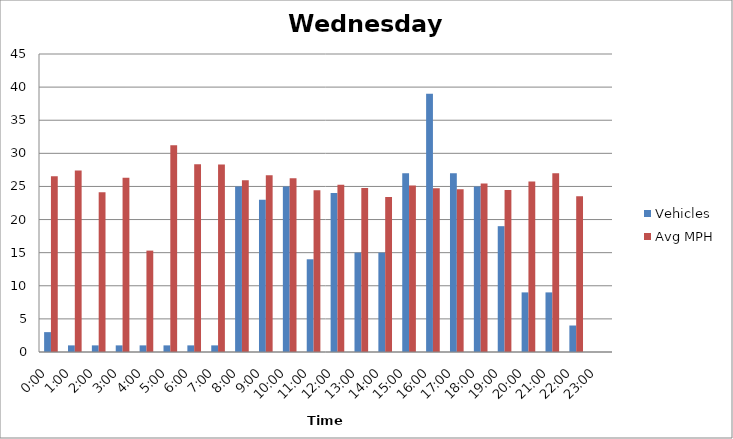
| Category | Vehicles | Avg MPH |
|---|---|---|
| 0:00 | 3 | 26.55 |
| 1:00 | 1 | 27.41 |
| 2:00 | 1 | 24.14 |
| 3:00 | 1 | 26.32 |
| 4:00 | 1 | 15.31 |
| 5:00 | 1 | 31.21 |
| 6:00 | 1 | 28.37 |
| 7:00 | 1 | 28.31 |
| 8:00 | 25 | 25.95 |
| 9:00 | 23 | 26.68 |
| 10:00 | 25 | 26.22 |
| 11:00 | 14 | 24.44 |
| 12:00 | 24 | 25.27 |
| 13:00 | 15 | 24.78 |
| 14:00 | 15 | 23.42 |
| 15:00 | 27 | 25.14 |
| 16:00 | 39 | 24.72 |
| 17:00 | 27 | 24.59 |
| 18:00 | 25 | 25.45 |
| 19:00 | 19 | 24.48 |
| 20:00 | 9 | 25.76 |
| 21:00 | 9 | 27.01 |
| 22:00 | 4 | 23.52 |
| 23:00 | 0 | 0 |